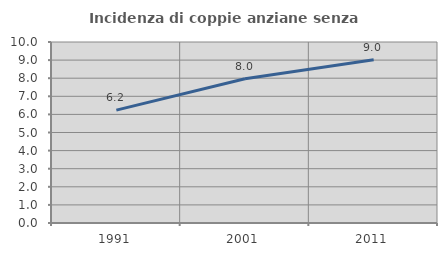
| Category | Incidenza di coppie anziane senza figli  |
|---|---|
| 1991.0 | 6.236 |
| 2001.0 | 7.973 |
| 2011.0 | 9.019 |